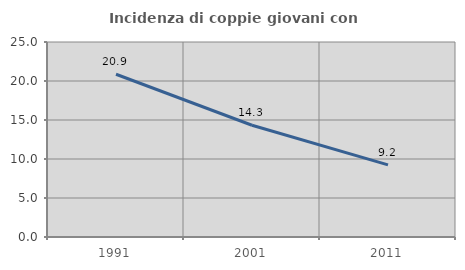
| Category | Incidenza di coppie giovani con figli |
|---|---|
| 1991.0 | 20.863 |
| 2001.0 | 14.329 |
| 2011.0 | 9.239 |